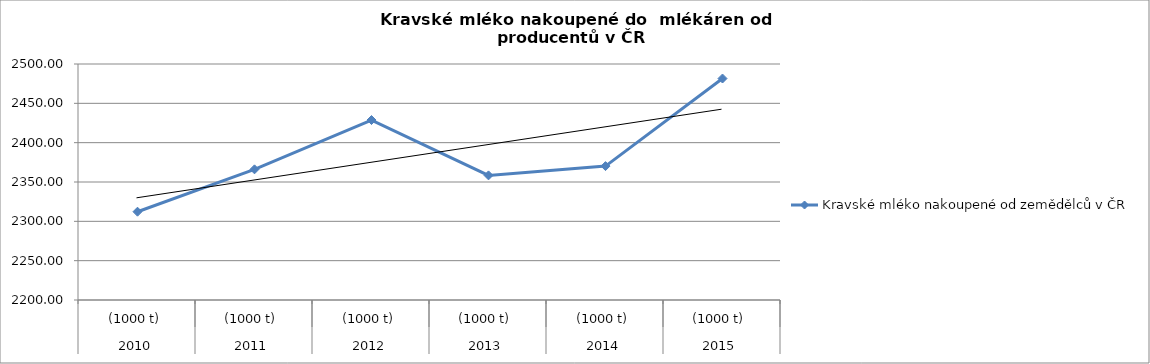
| Category | Kravské mléko nakoupené od zemědělců v ČR |
|---|---|
| 0 | 2312.226 |
| 1 | 2366.104 |
| 2 | 2428.774 |
| 3 | 2358.416 |
| 4 | 2370.204 |
| 5 | 2481.55 |